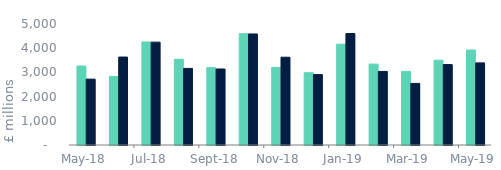
| Category | Full market | Remortgage without equity withdrawn |
|---|---|---|
| 2018-05-01 | 3262.257 | 2721.814 |
| 2018-06-01 | 2832.478 | 3633.812 |
| 2018-07-01 | 4257.972 | 4250.837 |
| 2018-08-01 | 3544.11 | 3164.571 |
| 2018-09-01 | 3196.659 | 3141.536 |
| 2018-10-01 | 4598.024 | 4589.26 |
| 2018-11-01 | 3205.305 | 3627.525 |
| 2018-12-01 | 2986.807 | 2910.33 |
| 2019-01-01 | 4165.29 | 4607.407 |
| 2019-02-01 | 3341.706 | 3040.379 |
| 2019-03-01 | 3039.154 | 2545.657 |
| 2019-04-01 | 3502.414 | 3325.208 |
| 2019-05-01 | 3924.062 | 3392.618 |